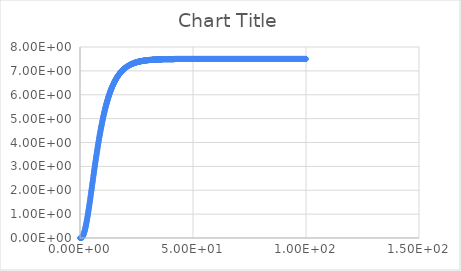
| Category | Series 0 |
|---|---|
| 0.1 | 0 |
| 0.2 | 0.001 |
| 0.3 | 0.002 |
| 0.4 | 0.004 |
| 0.5 | 0.007 |
| 0.6 | 0.011 |
| 0.7 | 0.018 |
| 0.8 | 0.025 |
| 0.9 | 0.035 |
| 1.0 | 0.046 |
| 1.1 | 0.06 |
| 1.2 | 0.076 |
| 1.3 | 0.094 |
| 1.4 | 0.114 |
| 1.5 | 0.136 |
| 1.6 | 0.16 |
| 1.7 | 0.187 |
| 1.8 | 0.215 |
| 1.9 | 0.246 |
| 2.0 | 0.279 |
| 2.1 | 0.314 |
| 2.2 | 0.352 |
| 2.3 | 0.391 |
| 2.4 | 0.432 |
| 2.5 | 0.475 |
| 2.6 | 0.519 |
| 2.7 | 0.566 |
| 2.8 | 0.614 |
| 2.9 | 0.664 |
| 3.0 | 0.715 |
| 3.1 | 0.768 |
| 3.2 | 0.822 |
| 3.3 | 0.877 |
| 3.4 | 0.934 |
| 3.5 | 0.992 |
| 3.6 | 1.05 |
| 3.7 | 1.11 |
| 3.8 | 1.17 |
| 3.9 | 1.23 |
| 4.0 | 1.3 |
| 4.1 | 1.36 |
| 4.2 | 1.42 |
| 4.3 | 1.49 |
| 4.4 | 1.55 |
| 4.5 | 1.62 |
| 4.6 | 1.69 |
| 4.7 | 1.75 |
| 4.8 | 1.82 |
| 4.9 | 1.89 |
| 5.0 | 1.96 |
| 5.1 | 2.02 |
| 5.2 | 2.09 |
| 5.3 | 2.16 |
| 5.4 | 2.23 |
| 5.5 | 2.3 |
| 5.6 | 2.36 |
| 5.7 | 2.43 |
| 5.8 | 2.5 |
| 5.9 | 2.57 |
| 6.0 | 2.64 |
| 6.1 | 2.7 |
| 6.2 | 2.77 |
| 6.3 | 2.84 |
| 6.4 | 2.9 |
| 6.5 | 2.97 |
| 6.6 | 3.04 |
| 6.7 | 3.1 |
| 6.8 | 3.17 |
| 6.9 | 3.23 |
| 7.0 | 3.29 |
| 7.1 | 3.36 |
| 7.2 | 3.42 |
| 7.3 | 3.48 |
| 7.4 | 3.54 |
| 7.5 | 3.61 |
| 7.6 | 3.67 |
| 7.7 | 3.73 |
| 7.8 | 3.79 |
| 7.9 | 3.85 |
| 8.0 | 3.9 |
| 8.1 | 3.96 |
| 8.2 | 4.02 |
| 8.3 | 4.08 |
| 8.4 | 4.13 |
| 8.5 | 4.19 |
| 8.6 | 4.24 |
| 8.7 | 4.3 |
| 8.8 | 4.35 |
| 8.9 | 4.4 |
| 9.0 | 4.45 |
| 9.1 | 4.51 |
| 9.2 | 4.56 |
| 9.3 | 4.61 |
| 9.4 | 4.66 |
| 9.5 | 4.7 |
| 9.6 | 4.75 |
| 9.7 | 4.8 |
| 9.8 | 4.85 |
| 9.9 | 4.89 |
| 10.0 | 4.94 |
| 10.1 | 4.98 |
| 10.2 | 5.03 |
| 10.3 | 5.07 |
| 10.4 | 5.11 |
| 10.5 | 5.16 |
| 10.6 | 5.2 |
| 10.7 | 5.24 |
| 10.8 | 5.28 |
| 10.9 | 5.32 |
| 11.0 | 5.36 |
| 11.1 | 5.4 |
| 11.2 | 5.44 |
| 11.3 | 5.47 |
| 11.4 | 5.51 |
| 11.5 | 5.55 |
| 11.6 | 5.58 |
| 11.7 | 5.62 |
| 11.8 | 5.65 |
| 11.9 | 5.68 |
| 12.0 | 5.72 |
| 12.1 | 5.75 |
| 12.2 | 5.78 |
| 12.3 | 5.81 |
| 12.4 | 5.85 |
| 12.5 | 5.88 |
| 12.6 | 5.91 |
| 12.7 | 5.94 |
| 12.8 | 5.96 |
| 12.9 | 5.99 |
| 13.0 | 6.02 |
| 13.1 | 6.05 |
| 13.2 | 6.08 |
| 13.3 | 6.1 |
| 13.4 | 6.13 |
| 13.5 | 6.16 |
| 13.6 | 6.18 |
| 13.7 | 6.21 |
| 13.8 | 6.23 |
| 13.9 | 6.25 |
| 14.0 | 6.28 |
| 14.1 | 6.3 |
| 14.2 | 6.32 |
| 14.3 | 6.35 |
| 14.4 | 6.37 |
| 14.5 | 6.39 |
| 14.6 | 6.41 |
| 14.7 | 6.43 |
| 14.8 | 6.45 |
| 14.9 | 6.47 |
| 15.0 | 6.49 |
| 15.1 | 6.51 |
| 15.2 | 6.53 |
| 15.3 | 6.55 |
| 15.4 | 6.57 |
| 15.5 | 6.58 |
| 15.6 | 6.6 |
| 15.7 | 6.62 |
| 15.8 | 6.64 |
| 15.9 | 6.65 |
| 16.0 | 6.67 |
| 16.1 | 6.68 |
| 16.2 | 6.7 |
| 16.3 | 6.72 |
| 16.4 | 6.73 |
| 16.5 | 6.75 |
| 16.6 | 6.76 |
| 16.7 | 6.77 |
| 16.8 | 6.79 |
| 16.9 | 6.8 |
| 17.0 | 6.82 |
| 17.1 | 6.83 |
| 17.2 | 6.84 |
| 17.3 | 6.86 |
| 17.4 | 6.87 |
| 17.5 | 6.88 |
| 17.6 | 6.89 |
| 17.7 | 6.9 |
| 17.8 | 6.92 |
| 17.9 | 6.93 |
| 18.0 | 6.94 |
| 18.1 | 6.95 |
| 18.2 | 6.96 |
| 18.3 | 6.97 |
| 18.4 | 6.98 |
| 18.5 | 6.99 |
| 18.6 | 7 |
| 18.7 | 7.01 |
| 18.8 | 7.02 |
| 18.9 | 7.03 |
| 19.0 | 7.04 |
| 19.1 | 7.05 |
| 19.2 | 7.06 |
| 19.3 | 7.07 |
| 19.4 | 7.07 |
| 19.5 | 7.08 |
| 19.6 | 7.09 |
| 19.7 | 7.1 |
| 19.8 | 7.11 |
| 19.9 | 7.11 |
| 20.0 | 7.12 |
| 20.1 | 7.13 |
| 20.2 | 7.14 |
| 20.3 | 7.14 |
| 20.4 | 7.15 |
| 20.5 | 7.16 |
| 20.6 | 7.16 |
| 20.7 | 7.17 |
| 20.8 | 7.18 |
| 20.9 | 7.18 |
| 21.0 | 7.19 |
| 21.1 | 7.2 |
| 21.2 | 7.2 |
| 21.3 | 7.21 |
| 21.4 | 7.21 |
| 21.5 | 7.22 |
| 21.6 | 7.22 |
| 21.7 | 7.23 |
| 21.8 | 7.24 |
| 21.9 | 7.24 |
| 22.0 | 7.25 |
| 22.1 | 7.25 |
| 22.2 | 7.26 |
| 22.3 | 7.26 |
| 22.4 | 7.26 |
| 22.5 | 7.27 |
| 22.6 | 7.27 |
| 22.7 | 7.28 |
| 22.8 | 7.28 |
| 22.9 | 7.29 |
| 23.0 | 7.29 |
| 23.1 | 7.3 |
| 23.2 | 7.3 |
| 23.3 | 7.3 |
| 23.4 | 7.31 |
| 23.5 | 7.31 |
| 23.6 | 7.31 |
| 23.7 | 7.32 |
| 23.8 | 7.32 |
| 23.9 | 7.33 |
| 24.0 | 7.33 |
| 24.1 | 7.33 |
| 24.2 | 7.34 |
| 24.3 | 7.34 |
| 24.4 | 7.34 |
| 24.5 | 7.35 |
| 24.6 | 7.35 |
| 24.7 | 7.35 |
| 24.8 | 7.35 |
| 24.9 | 7.36 |
| 25.0 | 7.36 |
| 25.1 | 7.36 |
| 25.2 | 7.37 |
| 25.3 | 7.37 |
| 25.4 | 7.37 |
| 25.5 | 7.37 |
| 25.6 | 7.38 |
| 25.7 | 7.38 |
| 25.8 | 7.38 |
| 25.9 | 7.38 |
| 26.0 | 7.39 |
| 26.1 | 7.39 |
| 26.2 | 7.39 |
| 26.3 | 7.39 |
| 26.4 | 7.39 |
| 26.5 | 7.4 |
| 26.6 | 7.4 |
| 26.7 | 7.4 |
| 26.8 | 7.4 |
| 26.9 | 7.4 |
| 27.0 | 7.41 |
| 27.1 | 7.41 |
| 27.2 | 7.41 |
| 27.3 | 7.41 |
| 27.4 | 7.41 |
| 27.5 | 7.41 |
| 27.6 | 7.42 |
| 27.7 | 7.42 |
| 27.8 | 7.42 |
| 27.9 | 7.42 |
| 28.0 | 7.42 |
| 28.1 | 7.42 |
| 28.2 | 7.43 |
| 28.3 | 7.43 |
| 28.4 | 7.43 |
| 28.5 | 7.43 |
| 28.6 | 7.43 |
| 28.7 | 7.43 |
| 28.8 | 7.43 |
| 28.9 | 7.44 |
| 29.0 | 7.44 |
| 29.1 | 7.44 |
| 29.2 | 7.44 |
| 29.3 | 7.44 |
| 29.4 | 7.44 |
| 29.5 | 7.44 |
| 29.6 | 7.44 |
| 29.7 | 7.45 |
| 29.8 | 7.45 |
| 29.9 | 7.45 |
| 30.0 | 7.45 |
| 30.1 | 7.45 |
| 30.2 | 7.45 |
| 30.3 | 7.45 |
| 30.4 | 7.45 |
| 30.5 | 7.45 |
| 30.6 | 7.45 |
| 30.7 | 7.46 |
| 30.8 | 7.46 |
| 30.9 | 7.46 |
| 31.0 | 7.46 |
| 31.1 | 7.46 |
| 31.2 | 7.46 |
| 31.3 | 7.46 |
| 31.4 | 7.46 |
| 31.5 | 7.46 |
| 31.6 | 7.46 |
| 31.7 | 7.46 |
| 31.8 | 7.46 |
| 31.9 | 7.46 |
| 32.0 | 7.47 |
| 32.1 | 7.47 |
| 32.2 | 7.47 |
| 32.3 | 7.47 |
| 32.4 | 7.47 |
| 32.5 | 7.47 |
| 32.6 | 7.47 |
| 32.7 | 7.47 |
| 32.8 | 7.47 |
| 32.9 | 7.47 |
| 33.0 | 7.47 |
| 33.1 | 7.47 |
| 33.2 | 7.47 |
| 33.3 | 7.47 |
| 33.4 | 7.47 |
| 33.5 | 7.47 |
| 33.6 | 7.47 |
| 33.7 | 7.48 |
| 33.8 | 7.48 |
| 33.9 | 7.48 |
| 34.0 | 7.48 |
| 34.1 | 7.48 |
| 34.2 | 7.48 |
| 34.3 | 7.48 |
| 34.4 | 7.48 |
| 34.5 | 7.48 |
| 34.6 | 7.48 |
| 34.7 | 7.48 |
| 34.8 | 7.48 |
| 34.9 | 7.48 |
| 35.0 | 7.48 |
| 35.1 | 7.48 |
| 35.2 | 7.48 |
| 35.3 | 7.48 |
| 35.4 | 7.48 |
| 35.5 | 7.48 |
| 35.6 | 7.48 |
| 35.7 | 7.48 |
| 35.8 | 7.48 |
| 35.9 | 7.48 |
| 36.0 | 7.48 |
| 36.1 | 7.48 |
| 36.2 | 7.48 |
| 36.3 | 7.49 |
| 36.4 | 7.49 |
| 36.5 | 7.49 |
| 36.6 | 7.49 |
| 36.7 | 7.49 |
| 36.8 | 7.49 |
| 36.9 | 7.49 |
| 37.0 | 7.49 |
| 37.1 | 7.49 |
| 37.2 | 7.49 |
| 37.3 | 7.49 |
| 37.4 | 7.49 |
| 37.5 | 7.49 |
| 37.6 | 7.49 |
| 37.7 | 7.49 |
| 37.8 | 7.49 |
| 37.9 | 7.49 |
| 38.0 | 7.49 |
| 38.1 | 7.49 |
| 38.2 | 7.49 |
| 38.3 | 7.49 |
| 38.4 | 7.49 |
| 38.5 | 7.49 |
| 38.6 | 7.49 |
| 38.7 | 7.49 |
| 38.8 | 7.49 |
| 38.9 | 7.49 |
| 39.0 | 7.49 |
| 39.1 | 7.49 |
| 39.2 | 7.49 |
| 39.3 | 7.49 |
| 39.4 | 7.49 |
| 39.5 | 7.49 |
| 39.6 | 7.49 |
| 39.7 | 7.49 |
| 39.8 | 7.49 |
| 39.9 | 7.49 |
| 40.0 | 7.49 |
| 40.1 | 7.49 |
| 40.2 | 7.49 |
| 40.3 | 7.49 |
| 40.4 | 7.49 |
| 40.5 | 7.49 |
| 40.6 | 7.49 |
| 40.7 | 7.49 |
| 40.8 | 7.49 |
| 40.9 | 7.49 |
| 41.0 | 7.49 |
| 41.1 | 7.49 |
| 41.2 | 7.49 |
| 41.3 | 7.49 |
| 41.4 | 7.49 |
| 41.5 | 7.49 |
| 41.6 | 7.49 |
| 41.7 | 7.49 |
| 41.8 | 7.5 |
| 41.9 | 7.5 |
| 42.0 | 7.5 |
| 42.1 | 7.5 |
| 42.2 | 7.5 |
| 42.3 | 7.5 |
| 42.4 | 7.5 |
| 42.5 | 7.5 |
| 42.6 | 7.5 |
| 42.7 | 7.5 |
| 42.8 | 7.5 |
| 42.9 | 7.5 |
| 43.0 | 7.5 |
| 43.1 | 7.5 |
| 43.2 | 7.5 |
| 43.3 | 7.5 |
| 43.4 | 7.5 |
| 43.5 | 7.5 |
| 43.6 | 7.5 |
| 43.7 | 7.5 |
| 43.8 | 7.5 |
| 43.9 | 7.5 |
| 44.0 | 7.5 |
| 44.1 | 7.5 |
| 44.2 | 7.5 |
| 44.3 | 7.5 |
| 44.4 | 7.5 |
| 44.5 | 7.5 |
| 44.6 | 7.5 |
| 44.7 | 7.5 |
| 44.8 | 7.5 |
| 44.9 | 7.5 |
| 45.0 | 7.5 |
| 45.1 | 7.5 |
| 45.2 | 7.5 |
| 45.3 | 7.5 |
| 45.4 | 7.5 |
| 45.5 | 7.5 |
| 45.6 | 7.5 |
| 45.7 | 7.5 |
| 45.8 | 7.5 |
| 45.9 | 7.5 |
| 46.0 | 7.5 |
| 46.1 | 7.5 |
| 46.2 | 7.5 |
| 46.3 | 7.5 |
| 46.4 | 7.5 |
| 46.5 | 7.5 |
| 46.6 | 7.5 |
| 46.7 | 7.5 |
| 46.8 | 7.5 |
| 46.9 | 7.5 |
| 47.0 | 7.5 |
| 47.1 | 7.5 |
| 47.2 | 7.5 |
| 47.3 | 7.5 |
| 47.4 | 7.5 |
| 47.5 | 7.5 |
| 47.6 | 7.5 |
| 47.7 | 7.5 |
| 47.8 | 7.5 |
| 47.9 | 7.5 |
| 48.0 | 7.5 |
| 48.1 | 7.5 |
| 48.2 | 7.5 |
| 48.3 | 7.5 |
| 48.4 | 7.5 |
| 48.5 | 7.5 |
| 48.6 | 7.5 |
| 48.7 | 7.5 |
| 48.8 | 7.5 |
| 48.9 | 7.5 |
| 49.0 | 7.5 |
| 49.1 | 7.5 |
| 49.2 | 7.5 |
| 49.3 | 7.5 |
| 49.4 | 7.5 |
| 49.5 | 7.5 |
| 49.6 | 7.5 |
| 49.7 | 7.5 |
| 49.8 | 7.5 |
| 49.9 | 7.5 |
| 50.0 | 7.5 |
| 50.1 | 7.5 |
| 50.2 | 7.5 |
| 50.3 | 7.5 |
| 50.4 | 7.5 |
| 50.5 | 7.5 |
| 50.6 | 7.5 |
| 50.7 | 7.5 |
| 50.8 | 7.5 |
| 50.9 | 7.5 |
| 51.0 | 7.5 |
| 51.1 | 7.5 |
| 51.2 | 7.5 |
| 51.3 | 7.5 |
| 51.4 | 7.5 |
| 51.5 | 7.5 |
| 51.6 | 7.5 |
| 51.7 | 7.5 |
| 51.8 | 7.5 |
| 51.9 | 7.5 |
| 52.0 | 7.5 |
| 52.1 | 7.5 |
| 52.2 | 7.5 |
| 52.3 | 7.5 |
| 52.4 | 7.5 |
| 52.5 | 7.5 |
| 52.6 | 7.5 |
| 52.7 | 7.5 |
| 52.8 | 7.5 |
| 52.9 | 7.5 |
| 53.0 | 7.5 |
| 53.1 | 7.5 |
| 53.2 | 7.5 |
| 53.3 | 7.5 |
| 53.4 | 7.5 |
| 53.5 | 7.5 |
| 53.6 | 7.5 |
| 53.7 | 7.5 |
| 53.8 | 7.5 |
| 53.9 | 7.5 |
| 54.0 | 7.5 |
| 54.1 | 7.5 |
| 54.2 | 7.5 |
| 54.3 | 7.5 |
| 54.4 | 7.5 |
| 54.5 | 7.5 |
| 54.6 | 7.5 |
| 54.7 | 7.5 |
| 54.8 | 7.5 |
| 54.9 | 7.5 |
| 55.0 | 7.5 |
| 55.1 | 7.5 |
| 55.2 | 7.5 |
| 55.3 | 7.5 |
| 55.4 | 7.5 |
| 55.5 | 7.5 |
| 55.6 | 7.5 |
| 55.7 | 7.5 |
| 55.8 | 7.5 |
| 55.9 | 7.5 |
| 56.0 | 7.5 |
| 56.1 | 7.5 |
| 56.2 | 7.5 |
| 56.3 | 7.5 |
| 56.4 | 7.5 |
| 56.5 | 7.5 |
| 56.6 | 7.5 |
| 56.7 | 7.5 |
| 56.8 | 7.5 |
| 56.9 | 7.5 |
| 57.0 | 7.5 |
| 57.1 | 7.5 |
| 57.2 | 7.5 |
| 57.3 | 7.5 |
| 57.4 | 7.5 |
| 57.5 | 7.5 |
| 57.6 | 7.5 |
| 57.7 | 7.5 |
| 57.8 | 7.5 |
| 57.9 | 7.5 |
| 58.0 | 7.5 |
| 58.1 | 7.5 |
| 58.2 | 7.5 |
| 58.3 | 7.5 |
| 58.4 | 7.5 |
| 58.5 | 7.5 |
| 58.6 | 7.5 |
| 58.7 | 7.5 |
| 58.8 | 7.5 |
| 58.9 | 7.5 |
| 59.0 | 7.5 |
| 59.1 | 7.5 |
| 59.2 | 7.5 |
| 59.3 | 7.5 |
| 59.4 | 7.5 |
| 59.5 | 7.5 |
| 59.6 | 7.5 |
| 59.7 | 7.5 |
| 59.8 | 7.5 |
| 59.9 | 7.5 |
| 60.0 | 7.5 |
| 60.1 | 7.5 |
| 60.2 | 7.5 |
| 60.3 | 7.5 |
| 60.4 | 7.5 |
| 60.5 | 7.5 |
| 60.6 | 7.5 |
| 60.7 | 7.5 |
| 60.8 | 7.5 |
| 60.9 | 7.5 |
| 61.0 | 7.5 |
| 61.1 | 7.5 |
| 61.2 | 7.5 |
| 61.3 | 7.5 |
| 61.4 | 7.5 |
| 61.5 | 7.5 |
| 61.6 | 7.5 |
| 61.7 | 7.5 |
| 61.8 | 7.5 |
| 61.9 | 7.5 |
| 62.0 | 7.5 |
| 62.1 | 7.5 |
| 62.2 | 7.5 |
| 62.3 | 7.5 |
| 62.4 | 7.5 |
| 62.5 | 7.5 |
| 62.6 | 7.5 |
| 62.7 | 7.5 |
| 62.8 | 7.5 |
| 62.9 | 7.5 |
| 63.0 | 7.5 |
| 63.1 | 7.5 |
| 63.2 | 7.5 |
| 63.3 | 7.5 |
| 63.4 | 7.5 |
| 63.5 | 7.5 |
| 63.6 | 7.5 |
| 63.7 | 7.5 |
| 63.8 | 7.5 |
| 63.9 | 7.5 |
| 64.0 | 7.5 |
| 64.1 | 7.5 |
| 64.2 | 7.5 |
| 64.3 | 7.5 |
| 64.4 | 7.5 |
| 64.5 | 7.5 |
| 64.6 | 7.5 |
| 64.7 | 7.5 |
| 64.8 | 7.5 |
| 64.9 | 7.5 |
| 65.0 | 7.5 |
| 65.1 | 7.5 |
| 65.2 | 7.5 |
| 65.3 | 7.5 |
| 65.4 | 7.5 |
| 65.5 | 7.5 |
| 65.6 | 7.5 |
| 65.7 | 7.5 |
| 65.8 | 7.5 |
| 65.9 | 7.5 |
| 66.0 | 7.5 |
| 66.1 | 7.5 |
| 66.2 | 7.5 |
| 66.3 | 7.5 |
| 66.4 | 7.5 |
| 66.5 | 7.5 |
| 66.6 | 7.5 |
| 66.7 | 7.5 |
| 66.8 | 7.5 |
| 66.9 | 7.5 |
| 67.0 | 7.5 |
| 67.1 | 7.5 |
| 67.2 | 7.5 |
| 67.3 | 7.5 |
| 67.4 | 7.5 |
| 67.5 | 7.5 |
| 67.6 | 7.5 |
| 67.7 | 7.5 |
| 67.8 | 7.5 |
| 67.9 | 7.5 |
| 68.0 | 7.5 |
| 68.1 | 7.5 |
| 68.2 | 7.5 |
| 68.3 | 7.5 |
| 68.4 | 7.5 |
| 68.5 | 7.5 |
| 68.6 | 7.5 |
| 68.7 | 7.5 |
| 68.8 | 7.5 |
| 68.9 | 7.5 |
| 69.0 | 7.5 |
| 69.1 | 7.5 |
| 69.2 | 7.5 |
| 69.3 | 7.5 |
| 69.4 | 7.5 |
| 69.5 | 7.5 |
| 69.6 | 7.5 |
| 69.7 | 7.5 |
| 69.8 | 7.5 |
| 69.9 | 7.5 |
| 70.0 | 7.5 |
| 70.1 | 7.5 |
| 70.2 | 7.5 |
| 70.3 | 7.5 |
| 70.4 | 7.5 |
| 70.5 | 7.5 |
| 70.6 | 7.5 |
| 70.7 | 7.5 |
| 70.8 | 7.5 |
| 70.9 | 7.5 |
| 71.0 | 7.5 |
| 71.1 | 7.5 |
| 71.2 | 7.5 |
| 71.3 | 7.5 |
| 71.4 | 7.5 |
| 71.5 | 7.5 |
| 71.6 | 7.5 |
| 71.7 | 7.5 |
| 71.8 | 7.5 |
| 71.9 | 7.5 |
| 72.0 | 7.5 |
| 72.1 | 7.5 |
| 72.2 | 7.5 |
| 72.3 | 7.5 |
| 72.4 | 7.5 |
| 72.5 | 7.5 |
| 72.6 | 7.5 |
| 72.7 | 7.5 |
| 72.8 | 7.5 |
| 72.9 | 7.5 |
| 73.0 | 7.5 |
| 73.1 | 7.5 |
| 73.2 | 7.5 |
| 73.3 | 7.5 |
| 73.4 | 7.5 |
| 73.5 | 7.5 |
| 73.6 | 7.5 |
| 73.7 | 7.5 |
| 73.8 | 7.5 |
| 73.9 | 7.5 |
| 74.0 | 7.5 |
| 74.1 | 7.5 |
| 74.2 | 7.5 |
| 74.3 | 7.5 |
| 74.4 | 7.5 |
| 74.5 | 7.5 |
| 74.6 | 7.5 |
| 74.7 | 7.5 |
| 74.8 | 7.5 |
| 74.9 | 7.5 |
| 75.0 | 7.5 |
| 75.1 | 7.5 |
| 75.2 | 7.5 |
| 75.3 | 7.5 |
| 75.4 | 7.5 |
| 75.5 | 7.5 |
| 75.6 | 7.5 |
| 75.7 | 7.5 |
| 75.8 | 7.5 |
| 75.9 | 7.5 |
| 76.0 | 7.5 |
| 76.1 | 7.5 |
| 76.2 | 7.5 |
| 76.3 | 7.5 |
| 76.4 | 7.5 |
| 76.5 | 7.5 |
| 76.6 | 7.5 |
| 76.7 | 7.5 |
| 76.8 | 7.5 |
| 76.9 | 7.5 |
| 77.0 | 7.5 |
| 77.1 | 7.5 |
| 77.2 | 7.5 |
| 77.3 | 7.5 |
| 77.4 | 7.5 |
| 77.5 | 7.5 |
| 77.6 | 7.5 |
| 77.7 | 7.5 |
| 77.8 | 7.5 |
| 77.9 | 7.5 |
| 78.0 | 7.5 |
| 78.1 | 7.5 |
| 78.2 | 7.5 |
| 78.3 | 7.5 |
| 78.4 | 7.5 |
| 78.5 | 7.5 |
| 78.6 | 7.5 |
| 78.7 | 7.5 |
| 78.8 | 7.5 |
| 78.9 | 7.5 |
| 79.0 | 7.5 |
| 79.1 | 7.5 |
| 79.2 | 7.5 |
| 79.3 | 7.5 |
| 79.4 | 7.5 |
| 79.5 | 7.5 |
| 79.6 | 7.5 |
| 79.7 | 7.5 |
| 79.8 | 7.5 |
| 79.9 | 7.5 |
| 80.0 | 7.5 |
| 80.1 | 7.5 |
| 80.2 | 7.5 |
| 80.3 | 7.5 |
| 80.4 | 7.5 |
| 80.5 | 7.5 |
| 80.6 | 7.5 |
| 80.7 | 7.5 |
| 80.8 | 7.5 |
| 80.9 | 7.5 |
| 81.0 | 7.5 |
| 81.1 | 7.5 |
| 81.2 | 7.5 |
| 81.3 | 7.5 |
| 81.4 | 7.5 |
| 81.5 | 7.5 |
| 81.6 | 7.5 |
| 81.7 | 7.5 |
| 81.8 | 7.5 |
| 81.9 | 7.5 |
| 82.0 | 7.5 |
| 82.1 | 7.5 |
| 82.2 | 7.5 |
| 82.3 | 7.5 |
| 82.4 | 7.5 |
| 82.5 | 7.5 |
| 82.6 | 7.5 |
| 82.7 | 7.5 |
| 82.8 | 7.5 |
| 82.9 | 7.5 |
| 83.0 | 7.5 |
| 83.1 | 7.5 |
| 83.2 | 7.5 |
| 83.3 | 7.5 |
| 83.4 | 7.5 |
| 83.5 | 7.5 |
| 83.6 | 7.5 |
| 83.7 | 7.5 |
| 83.8 | 7.5 |
| 83.9 | 7.5 |
| 84.0 | 7.5 |
| 84.1 | 7.5 |
| 84.2 | 7.5 |
| 84.3 | 7.5 |
| 84.4 | 7.5 |
| 84.5 | 7.5 |
| 84.6 | 7.5 |
| 84.7 | 7.5 |
| 84.8 | 7.5 |
| 84.9 | 7.5 |
| 85.0 | 7.5 |
| 85.1 | 7.5 |
| 85.2 | 7.5 |
| 85.3 | 7.5 |
| 85.4 | 7.5 |
| 85.5 | 7.5 |
| 85.6 | 7.5 |
| 85.7 | 7.5 |
| 85.8 | 7.5 |
| 85.9 | 7.5 |
| 86.0 | 7.5 |
| 86.1 | 7.5 |
| 86.2 | 7.5 |
| 86.3 | 7.5 |
| 86.4 | 7.5 |
| 86.5 | 7.5 |
| 86.6 | 7.5 |
| 86.7 | 7.5 |
| 86.8 | 7.5 |
| 86.9 | 7.5 |
| 87.0 | 7.5 |
| 87.1 | 7.5 |
| 87.2 | 7.5 |
| 87.3 | 7.5 |
| 87.4 | 7.5 |
| 87.5 | 7.5 |
| 87.6 | 7.5 |
| 87.7 | 7.5 |
| 87.8 | 7.5 |
| 87.9 | 7.5 |
| 88.0 | 7.5 |
| 88.1 | 7.5 |
| 88.2 | 7.5 |
| 88.3 | 7.5 |
| 88.4 | 7.5 |
| 88.5 | 7.5 |
| 88.6 | 7.5 |
| 88.7 | 7.5 |
| 88.8 | 7.5 |
| 88.9 | 7.5 |
| 89.0 | 7.5 |
| 89.1 | 7.5 |
| 89.2 | 7.5 |
| 89.3 | 7.5 |
| 89.4 | 7.5 |
| 89.5 | 7.5 |
| 89.6 | 7.5 |
| 89.7 | 7.5 |
| 89.8 | 7.5 |
| 89.9 | 7.5 |
| 90.0 | 7.5 |
| 90.1 | 7.5 |
| 90.2 | 7.5 |
| 90.3 | 7.5 |
| 90.4 | 7.5 |
| 90.5 | 7.5 |
| 90.6 | 7.5 |
| 90.7 | 7.5 |
| 90.8 | 7.5 |
| 90.9 | 7.5 |
| 91.0 | 7.5 |
| 91.1 | 7.5 |
| 91.2 | 7.5 |
| 91.3 | 7.5 |
| 91.4 | 7.5 |
| 91.5 | 7.5 |
| 91.6 | 7.5 |
| 91.7 | 7.5 |
| 91.8 | 7.5 |
| 91.9 | 7.5 |
| 92.0 | 7.5 |
| 92.1 | 7.5 |
| 92.2 | 7.5 |
| 92.3 | 7.5 |
| 92.4 | 7.5 |
| 92.5 | 7.5 |
| 92.6 | 7.5 |
| 92.7 | 7.5 |
| 92.8 | 7.5 |
| 92.9 | 7.5 |
| 93.0 | 7.5 |
| 93.1 | 7.5 |
| 93.2 | 7.5 |
| 93.3 | 7.5 |
| 93.4 | 7.5 |
| 93.5 | 7.5 |
| 93.6 | 7.5 |
| 93.7 | 7.5 |
| 93.8 | 7.5 |
| 93.9 | 7.5 |
| 94.0 | 7.5 |
| 94.1 | 7.5 |
| 94.2 | 7.5 |
| 94.3 | 7.5 |
| 94.4 | 7.5 |
| 94.5 | 7.5 |
| 94.6 | 7.5 |
| 94.7 | 7.5 |
| 94.8 | 7.5 |
| 94.9 | 7.5 |
| 95.0 | 7.5 |
| 95.1 | 7.5 |
| 95.2 | 7.5 |
| 95.3 | 7.5 |
| 95.4 | 7.5 |
| 95.5 | 7.5 |
| 95.6 | 7.5 |
| 95.7 | 7.5 |
| 95.8 | 7.5 |
| 95.9 | 7.5 |
| 96.0 | 7.5 |
| 96.1 | 7.5 |
| 96.2 | 7.5 |
| 96.3 | 7.5 |
| 96.4 | 7.5 |
| 96.5 | 7.5 |
| 96.6 | 7.5 |
| 96.7 | 7.5 |
| 96.8 | 7.5 |
| 96.9 | 7.5 |
| 97.0 | 7.5 |
| 97.1 | 7.5 |
| 97.2 | 7.5 |
| 97.3 | 7.5 |
| 97.4 | 7.5 |
| 97.5 | 7.5 |
| 97.6 | 7.5 |
| 97.7 | 7.5 |
| 97.8 | 7.5 |
| 97.9 | 7.5 |
| 98.0 | 7.5 |
| 98.1 | 7.5 |
| 98.2 | 7.5 |
| 98.3 | 7.5 |
| 98.4 | 7.5 |
| 98.5 | 7.5 |
| 98.6 | 7.5 |
| 98.7 | 7.5 |
| 98.8 | 7.5 |
| 98.9 | 7.5 |
| 99.0 | 7.5 |
| 99.1 | 7.5 |
| 99.2 | 7.5 |
| 99.3 | 7.5 |
| 99.4 | 7.5 |
| 99.5 | 7.5 |
| 99.6 | 7.5 |
| 99.7 | 7.5 |
| 99.8 | 7.5 |
| 99.9 | 7.5 |